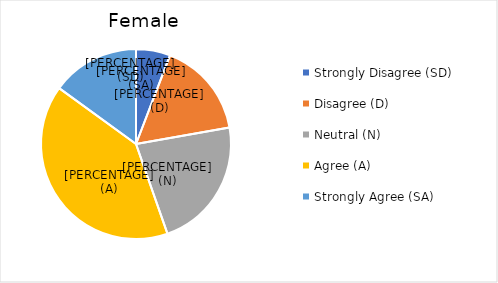
| Category | Female | Male |
|---|---|---|
| Strongly Disagree (SD) | 0.058 | 0.074 |
| Disagree (D) | 0.164 | 0.177 |
| Neutral (N) | 0.224 | 0.264 |
| Agree (A) | 0.404 | 0.329 |
| Strongly Agree (SA) | 0.15 | 0.157 |